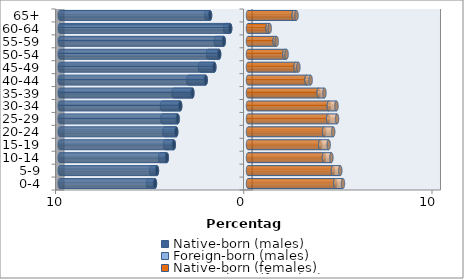
| Category | Native-born (males) | Foreign-born (males) | Native-born (females) | Foreign-born (females) |
|---|---|---|---|---|
| 0-4 | -4.944 | -0.36 | 4.638 | 0.408 |
| 5-9 | -4.837 | -0.309 | 4.512 | 0.391 |
| 10-14 | -4.314 | -0.353 | 4.032 | 0.399 |
| 15-19 | -3.943 | -0.461 | 3.836 | 0.45 |
| 20-24 | -3.815 | -0.627 | 4.043 | 0.484 |
| 25-29 | -3.739 | -0.809 | 4.257 | 0.474 |
| 30-34 | -3.603 | -0.966 | 4.295 | 0.404 |
| 35-39 | -2.955 | -0.999 | 3.757 | 0.303 |
| 40-44 | -2.247 | -0.927 | 3.109 | 0.217 |
| 45-49 | -1.79 | -0.761 | 2.527 | 0.151 |
| 50-54 | -1.534 | -0.583 | 1.935 | 0.115 |
| 55-59 | -1.289 | -0.415 | 1.42 | 0.105 |
| 60-64 | -0.948 | -0.267 | 1.044 | 0.109 |
| 65+ | -2.017 | -0.198 | 2.43 | 0.146 |